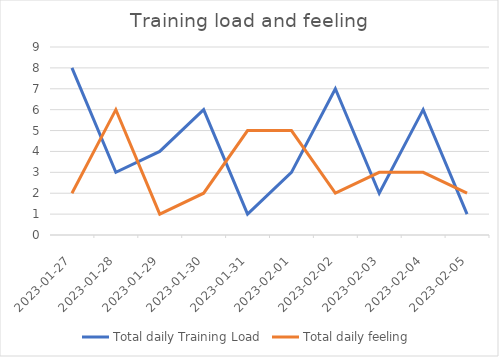
| Category | Total daily Training Load | Total daily feeling |
|---|---|---|
| 2023-01-27 | 8 | 2 |
| 2023-01-28 | 3 | 6 |
| 2023-01-29 | 4 | 1 |
| 2023-01-30 | 6 | 2 |
| 2023-01-31 | 1 | 5 |
| 2023-02-01 | 3 | 5 |
| 2023-02-02 | 7 | 2 |
| 2023-02-03 | 2 | 3 |
| 2023-02-04 | 6 | 3 |
| 2023-02-05 | 1 | 2 |